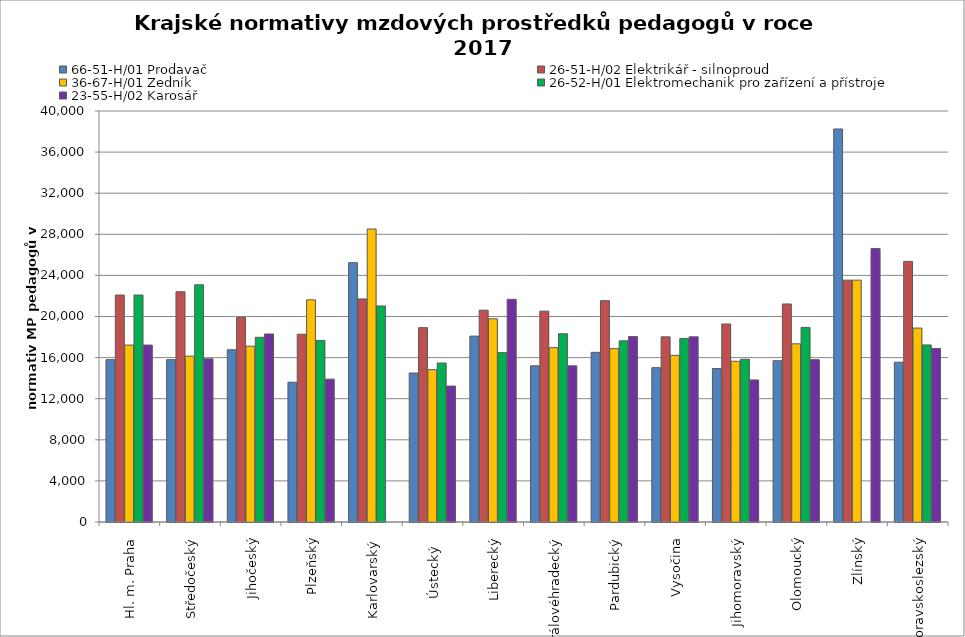
| Category | 66-51-H/01 Prodavač | 26-51-H/02 Elektrikář - silnoproud | 36-67-H/01 Zedník | 26-52-H/01 Elektromechanik pro zařízení a přístroje | 23-55-H/02 Karosář |
|---|---|---|---|---|---|
| Hl. m. Praha | 15800.471 | 22089.474 | 17218.462 | 22089.474 | 17218.462 |
| Středočeský | 15799.849 | 22409.843 | 16144.469 | 23085.202 | 15876.431 |
| Jihočeský | 16757.619 | 19913.404 | 17114.721 | 17974.552 | 18299.393 |
| Plzeňský | 13599.219 | 18272.613 | 21618.622 | 17670.015 | 13903.234 |
| Karlovarský  | 25238.468 | 21708.137 | 28515.901 | 21029.316 | 0 |
| Ústecký   | 14499.491 | 18915.045 | 14822.159 | 15474.246 | 13230.938 |
| Liberecký | 18091.044 | 20616.487 | 19774.689 | 16483.898 | 21671.345 |
| Královéhradecký | 15197.368 | 20520.305 | 16967.471 | 18322.946 | 15197.368 |
| Pardubický | 16511.433 | 21541.176 | 16873.725 | 17627.966 | 18041.525 |
| Vysočina | 15021.281 | 18018.038 | 16220.191 | 17867.027 | 18022.128 |
| Jihomoravský | 14936.23 | 19270.69 | 15641.978 | 15836.445 | 13827.513 |
| Olomoucký | 15693.927 | 21221.168 | 17339.761 | 18940.065 | 15800.543 |
| Zlínský | 38251.5 | 23539.385 | 23539.385 | 0 | 26609.739 |
| Moravskoslezský | 15552.704 | 25363.229 | 18874.305 | 17235.145 | 16875.186 |